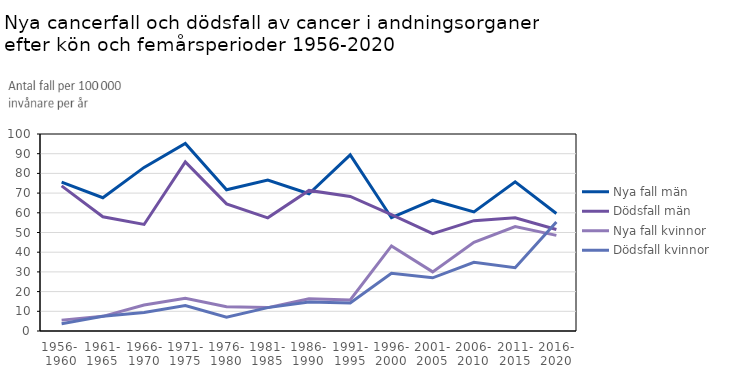
| Category | Nya fall män | Dödsfall män | Nya fall kvinnor | Dödsfall kvinnor |
|---|---|---|---|---|
| 1956- 
1960 | 75.59 | 73.65 | 5.52 | 3.68 |
| 1961-
1965 | 67.64 | 57.98 | 7.44 | 7.44 |
| 1966-
1970 | 83.05 | 54.08 | 13.22 | 9.44 |
| 1971-
1975 | 95.16 | 85.83 | 16.62 | 12.92 |
| 1976-
1980 | 71.68 | 64.52 | 12.34 | 7.05 |
| 1981-
1985 | 76.57 | 57.43 | 11.87 | 11.87 |
| 1986-
1990 | 69.67 | 71.36 | 16.41 | 14.77 |
| 1991-
1995 | 89.44 | 68.3 | 15.75 | 14.17 |
| 1996-
2000 | 57.51 | 59.1 | 43.17 | 29.29 |
| 2001-
2005 | 66.4 | 49.41 | 30.01 | 27.01 |
| 2006-
2010 | 60.42 | 56 | 45.06 | 34.89 |
| 2011-
2015 | 75.73 | 57.5 | 53.05 | 32.11 |
| 2016-
2020 | 59.64 | 51.51 | 48.54 | 55.29 |